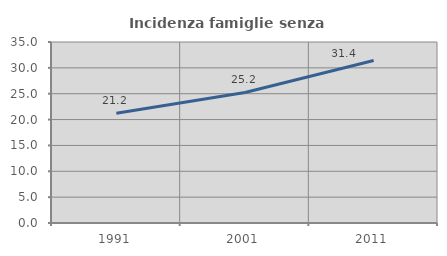
| Category | Incidenza famiglie senza nuclei |
|---|---|
| 1991.0 | 21.239 |
| 2001.0 | 25.237 |
| 2011.0 | 31.423 |